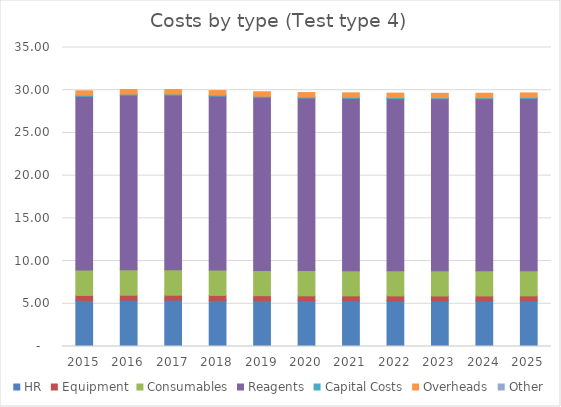
| Category | HR | Equipment | Consumables | Reagents | Capital Costs | Overheads | Other |
|---|---|---|---|---|---|---|---|
| 2015.0 | 5.391 | 0.584 | 2.968 | 20.342 | 0.117 | 0.527 | 0 |
| 2016.0 | 5.418 | 0.587 | 2.983 | 20.441 | 0.118 | 0.53 | 0 |
| 2017.0 | 5.418 | 0.587 | 2.983 | 20.443 | 0.118 | 0.53 | 0 |
| 2018.0 | 5.396 | 0.585 | 2.971 | 20.361 | 0.117 | 0.528 | 0 |
| 2019.0 | 5.372 | 0.582 | 2.957 | 20.267 | 0.117 | 0.525 | 0 |
| 2020.0 | 5.355 | 0.58 | 2.948 | 20.204 | 0.116 | 0.524 | 0 |
| 2021.0 | 5.348 | 0.58 | 2.944 | 20.179 | 0.116 | 0.523 | 0 |
| 2022.0 | 5.343 | 0.579 | 2.941 | 20.158 | 0.116 | 0.522 | 0 |
| 2023.0 | 5.339 | 0.579 | 2.939 | 20.145 | 0.116 | 0.522 | 0 |
| 2024.0 | 5.34 | 0.579 | 2.94 | 20.149 | 0.116 | 0.522 | 0 |
| 2025.0 | 5.347 | 0.58 | 2.944 | 20.174 | 0.116 | 0.523 | 0 |